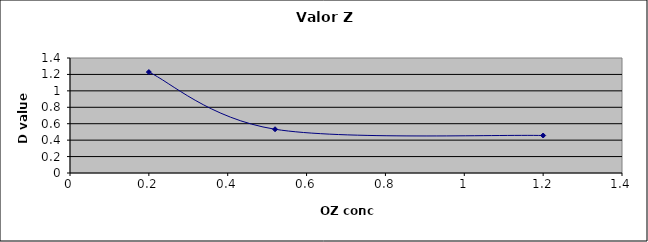
| Category | Series 0 |
|---|---|
| 1.2 | 0.456 |
| 0.52 | 0.533 |
| 0.2 | 1.229 |